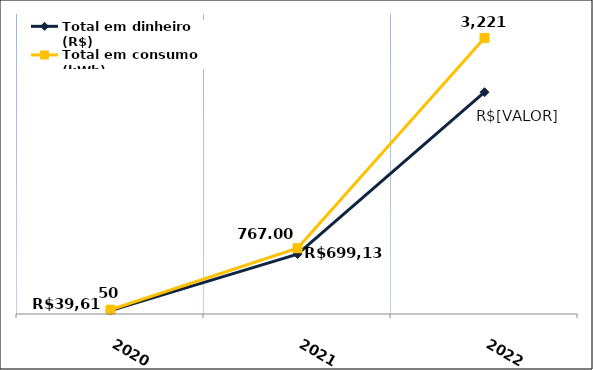
| Category | Total em dinheiro (R$) |
|---|---|
| 2020.0 | 39.61 |
| 2021.0 | 699.13 |
| 2022.0 | 2587.24 |